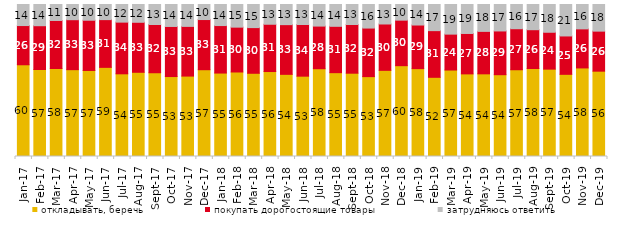
| Category | откладывать, беречь | покупать дорогостоящие товары | затрудняюсь ответить |
|---|---|---|---|
| 2017-01-01 | 60.35 | 25.8 | 13.85 |
| 2017-02-01 | 56.8 | 28.6 | 13.85 |
| 2017-03-01 | 57.9 | 31.6 | 10.5 |
| 2017-04-01 | 57.1 | 32.85 | 10 |
| 2017-05-01 | 56.6 | 33.05 | 10.35 |
| 2017-06-01 | 58.65 | 31.4 | 9.95 |
| 2017-07-01 | 54.4 | 34 | 11.6 |
| 2017-08-01 | 55.4 | 32.9 | 11.7 |
| 2017-09-01 | 55.1 | 31.75 | 13.15 |
| 2017-10-01 | 52.6 | 32.95 | 14.45 |
| 2017-11-01 | 52.9 | 32.7 | 14.4 |
| 2017-12-01 | 57.1 | 33 | 9.9 |
| 2018-01-01 | 54.9 | 31.25 | 13.85 |
| 2018-02-01 | 55.6 | 29.5 | 14.9 |
| 2018-03-01 | 54.75 | 30.05 | 15.2 |
| 2018-04-01 | 55.9 | 31.1 | 13 |
| 2018-05-01 | 54.05 | 32.7 | 13.25 |
| 2018-06-01 | 52.85 | 34 | 13.15 |
| 2018-07-01 | 57.75 | 28.05 | 14.2 |
| 2018-08-01 | 55.15 | 30.5 | 14.35 |
| 2018-09-01 | 54.8 | 32.05 | 13.15 |
| 2018-10-01 | 52.55 | 31.95 | 15.5 |
| 2018-11-01 | 56.687 | 30.489 | 12.824 |
| 2018-12-01 | 59.75 | 29.95 | 10.3 |
| 2019-01-01 | 57.8 | 28.7 | 13.5 |
| 2019-02-01 | 52.1 | 30.7 | 17.2 |
| 2019-03-01 | 56.887 | 23.62 | 19.493 |
| 2019-04-01 | 54.356 | 26.584 | 19.059 |
| 2019-05-01 | 54.383 | 27.935 | 17.682 |
| 2019-06-01 | 53.815 | 28.778 | 17.406 |
| 2019-07-01 | 57.079 | 26.98 | 15.941 |
| 2019-08-01 | 57.892 | 25.524 | 16.583 |
| 2019-09-01 | 57.475 | 24.257 | 18.267 |
| 2019-10-01 | 54.059 | 25.248 | 20.693 |
| 2019-11-01 | 58.267 | 25.693 | 16.04 |
| 2019-12-01 | 56.139 | 26.337 | 17.525 |